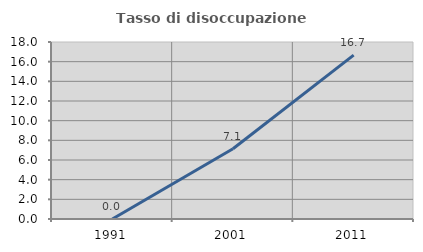
| Category | Tasso di disoccupazione giovanile  |
|---|---|
| 1991.0 | 0 |
| 2001.0 | 7.143 |
| 2011.0 | 16.667 |